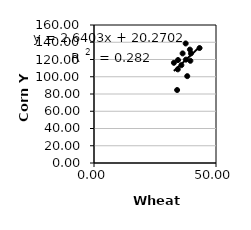
| Category | Series 0 |
|---|---|
| 34.42797621988373 | 119.375 |
| 37.674233622307625 | 119.844 |
| 34.07033276931754 | 84.613 |
| 32.74831966554108 | 116.165 |
| 39.49809468822171 | 118.503 |
| 34.33337954699063 | 108.581 |
| 39.30463185736365 | 131.48 |
| 38.21342007909172 | 100.705 |
| 37.57456694188117 | 138.608 |
| 35.812470260070555 | 113.453 |
| 36.31403054332798 | 127.051 |
| 39.740031772496344 | 127.043 |
| 43.2652760860739 | 133.3 |